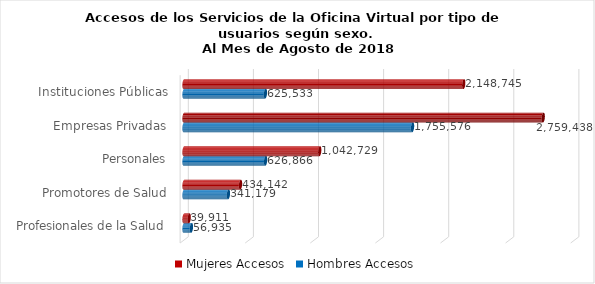
| Category | Mujeres | Hombres |
|---|---|---|
| Instituciones Públicas | 2148745 | 625533 |
| Empresas Privadas | 2759438 | 1755576 |
| Personales | 1042729 | 626866 |
| Promotores de Salud | 434142 | 341179 |
| Profesionales de la Salud | 39911 | 56935 |